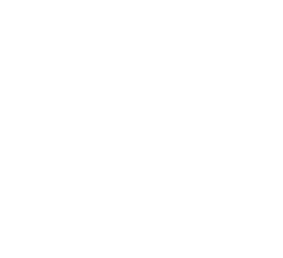
| Category | Series 1 |
|---|---|
| Votre ES | 0 |
| AM | 0 |
| Patient | 0 |
| ES Receveur | 0 |